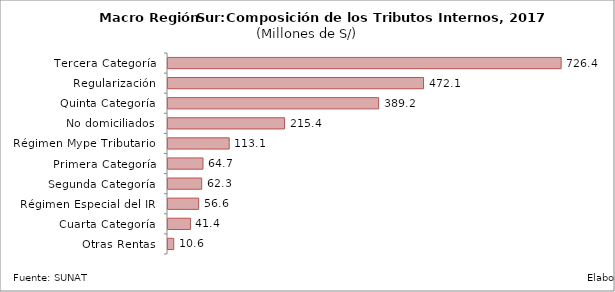
| Category | Series 0 | Series 1 | Series 2 |
|---|---|---|---|
|    Tercera Categoría |  |  | 726.406 |
|    Regularización |  |  | 472.123 |
|    Quinta Categoría |  |  | 389.197 |
|    No domiciliados |  |  | 215.37 |
|    Régimen Mype Tributario |  |  | 113.085 |
|    Primera Categoría |  |  | 64.66 |
|    Segunda Categoría |  |  | 62.265 |
|    Régimen Especial del IR |  |  | 56.617 |
|    Cuarta Categoría |  |  | 41.445 |
|    Otras Rentas |  |  | 10.598 |